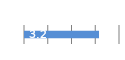
| Category | Series 0 |
|---|---|
| 0 | 3.159 |